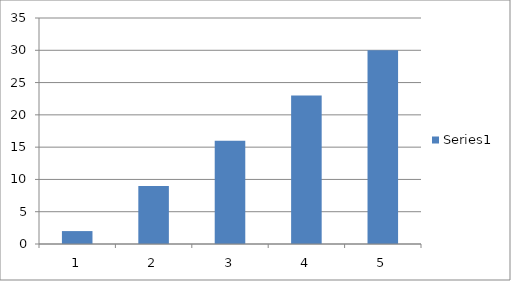
| Category | Series 0 |
|---|---|
| 0 | 2 |
| 1 | 9 |
| 2 | 16 |
| 3 | 23 |
| 4 | 30 |